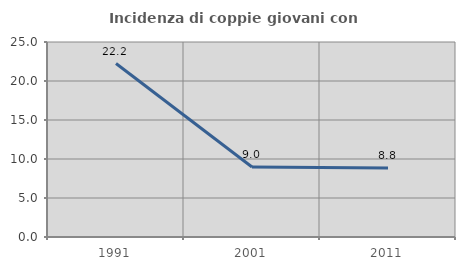
| Category | Incidenza di coppie giovani con figli |
|---|---|
| 1991.0 | 22.238 |
| 2001.0 | 8.976 |
| 2011.0 | 8.833 |